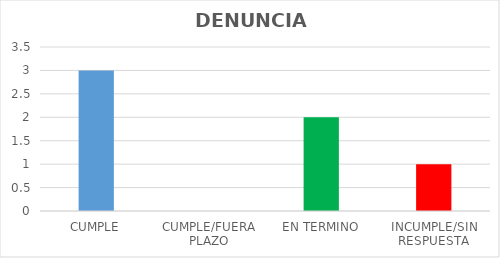
| Category | TOTAL |
|---|---|
| CUMPLE | 3 |
| CUMPLE/FUERA PLAZO | 0 |
| EN TERMINO | 2 |
| INCUMPLE/SIN RESPUESTA | 1 |